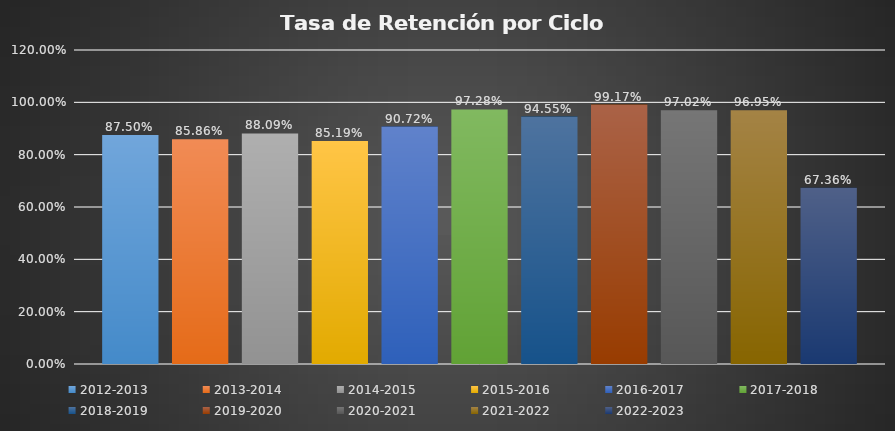
| Category | 2012-2013 | 2013-2014 | 2014-2015 | 2015-2016  | 2016-2017 | 2017-2018 | 2018-2019 | 2019-2020 | 2020-2021 | 2021-2022 | 2022-2023 |
|---|---|---|---|---|---|---|---|---|---|---|---|
| 0 | 0.875 | 0.859 | 0.881 | 0.852 | 0.907 | 0.973 | 0.946 | 0.992 | 0.97 | 0.97 | 0.674 |